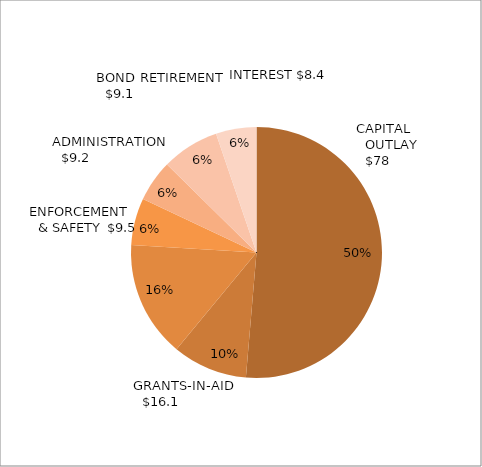
| Category | Series 0 | Data C |
|---|---|---|
| 0 | 80.501 | 0 |
| 1 | 15.129 | 0 |
| 2 | 23.452 | 0 |
| 3 | 9.486 | 0 |
| 4 | 8.397 | 0 |
| 5 | 11.623 | 0 |
| 6 | 8.188 | 0 |